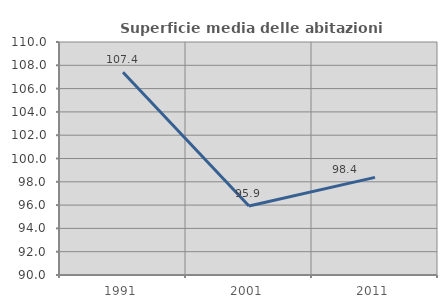
| Category | Superficie media delle abitazioni occupate |
|---|---|
| 1991.0 | 107.403 |
| 2001.0 | 95.918 |
| 2011.0 | 98.382 |